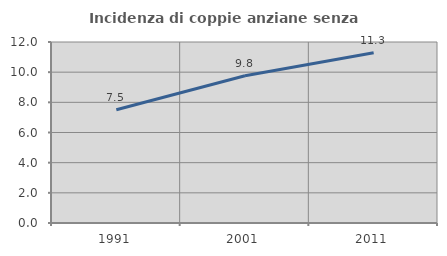
| Category | Incidenza di coppie anziane senza figli  |
|---|---|
| 1991.0 | 7.511 |
| 2001.0 | 9.766 |
| 2011.0 | 11.282 |